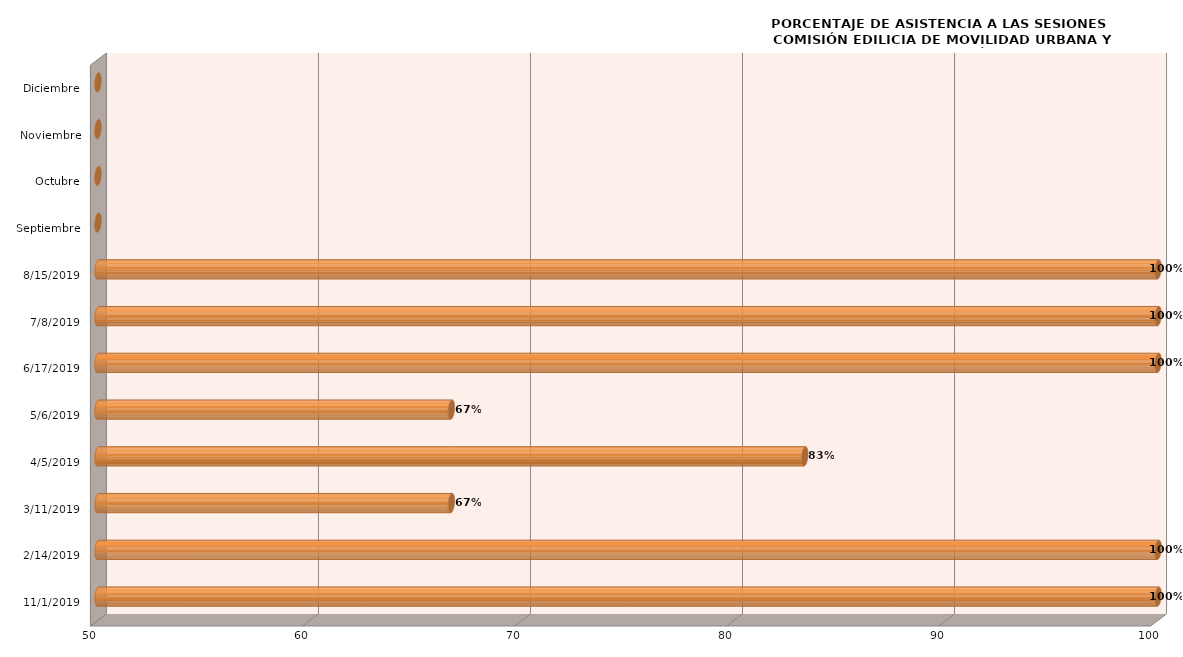
| Category | Series 0 |
|---|---|
| 01/11/2019 | 100 |
| 14/02/2019 | 100 |
| 11/03/2019 | 66.667 |
| 05/04/2019 | 83.333 |
| 06/05/2019 | 66.667 |
| 17/06/2019 | 100 |
| 08/07/2019 | 100 |
| 15/08/2019 | 100 |
| Septiembre | 0 |
| Octubre | 0 |
| Noviembre | 0 |
| Diciembre | 0 |